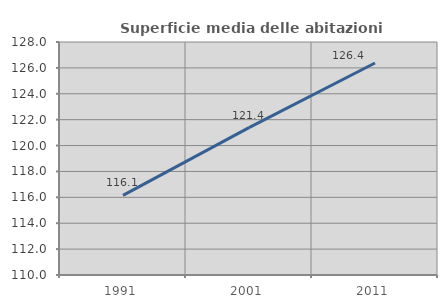
| Category | Superficie media delle abitazioni occupate |
|---|---|
| 1991.0 | 116.146 |
| 2001.0 | 121.389 |
| 2011.0 | 126.377 |